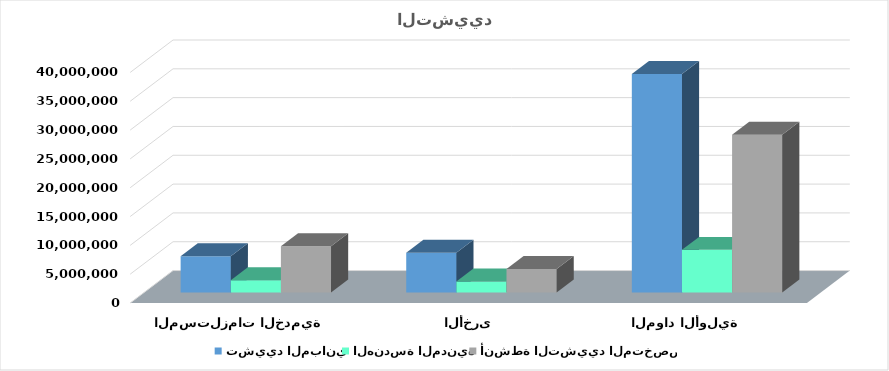
| Category | تشييد المباني | الهندسة المدنية | أنشطة التشييد المتخصصة |
|---|---|---|---|
| المواد الأولية   | 37890623.507 | 7393223.463 | 27353193.771 |
| المستلزمات السلعية الأخرى | 6913786.283 | 1927839.443 | 4058901.179 |
| المستلزمات الخدمية | 6304713.509 | 2111568.796 | 8006952.812 |